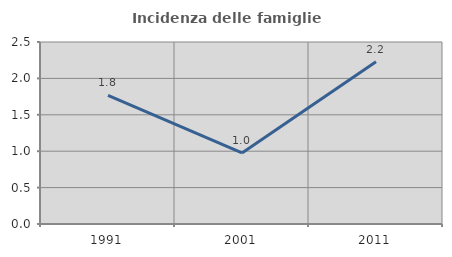
| Category | Incidenza delle famiglie numerose |
|---|---|
| 1991.0 | 1.767 |
| 2001.0 | 0.976 |
| 2011.0 | 2.228 |